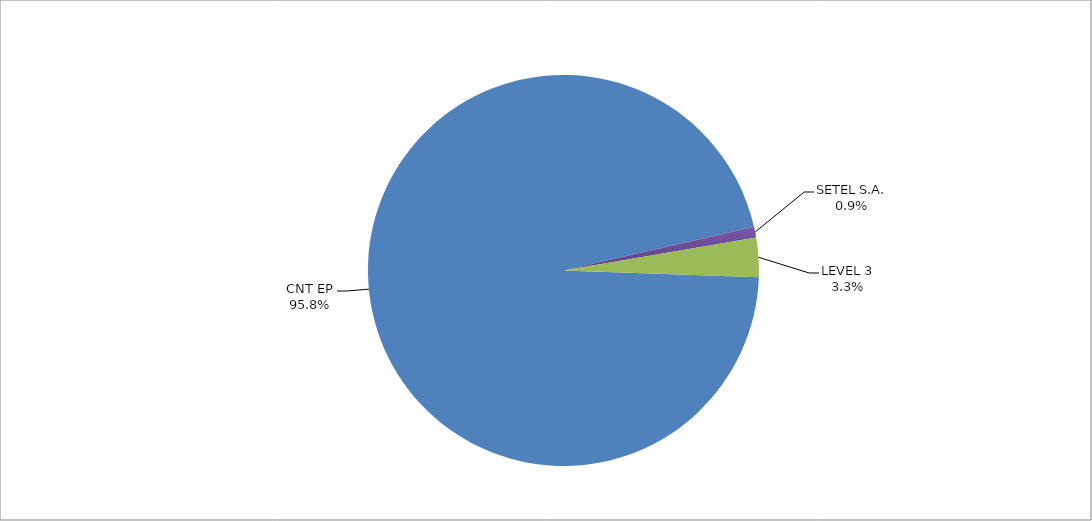
| Category | Series 0 |
|---|---|
| CNT EP | 323 |
| SETEL S.A. | 3 |
| LEVEL 3 | 11 |